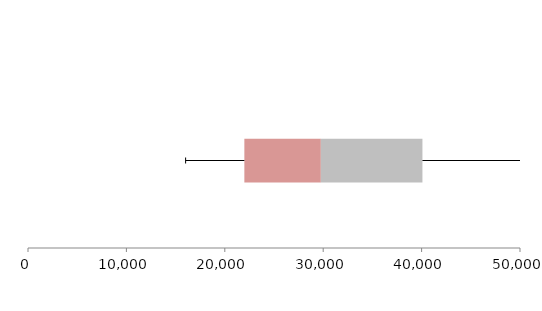
| Category | Series 1 | Series 2 | Series 3 |
|---|---|---|---|
| 0 | 21987.369 | 7773.903 | 10324.014 |